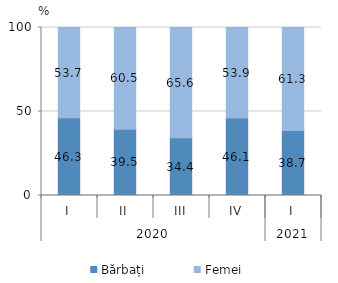
| Category | Bărbați | Femei |
|---|---|---|
| 0 | 46.3 | 53.7 |
| 1 | 39.5 | 60.5 |
| 2 | 34.4 | 65.6 |
| 3 | 46.1 | 53.9 |
| 4 | 38.7 | 61.3 |